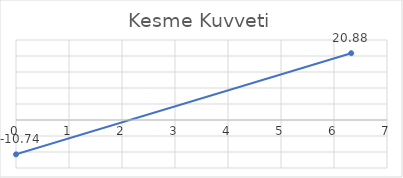
| Category | Series 0 |
|---|---|
| 0.0 | -10.742 |
| 6.324555320336759 | 20.881 |